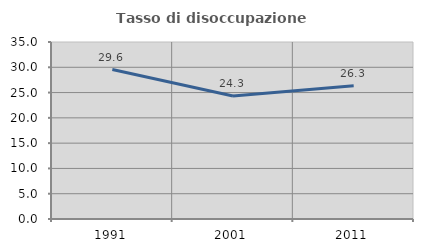
| Category | Tasso di disoccupazione giovanile  |
|---|---|
| 1991.0 | 29.557 |
| 2001.0 | 24.324 |
| 2011.0 | 26.339 |